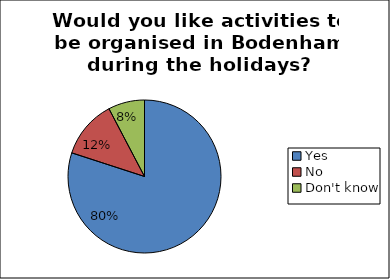
| Category | Series 0 |
|---|---|
| Yes | 0.8 |
| No | 0.123 |
| Don't know | 0.077 |